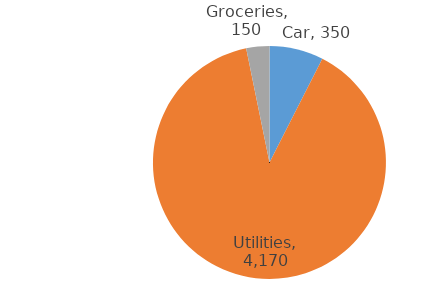
| Category | Total |
|---|---|
| Car | 350 |
| Utilities | 4170 |
| Groceries | 150 |